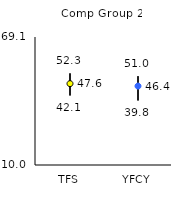
| Category | 25th | 75th | Mean |
|---|---|---|---|
| TFS | 42.1 | 52.3 | 47.56 |
| YFCY | 39.8 | 51 | 46.44 |